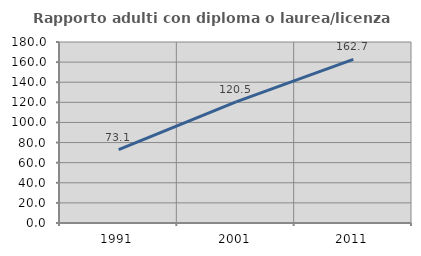
| Category | Rapporto adulti con diploma o laurea/licenza media  |
|---|---|
| 1991.0 | 73.077 |
| 2001.0 | 120.504 |
| 2011.0 | 162.681 |